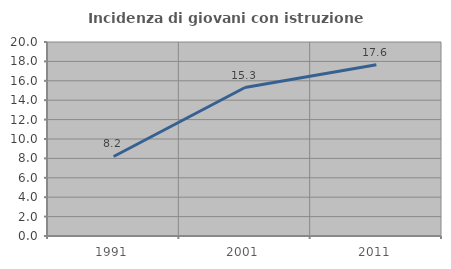
| Category | Incidenza di giovani con istruzione universitaria |
|---|---|
| 1991.0 | 8.197 |
| 2001.0 | 15.306 |
| 2011.0 | 17.647 |